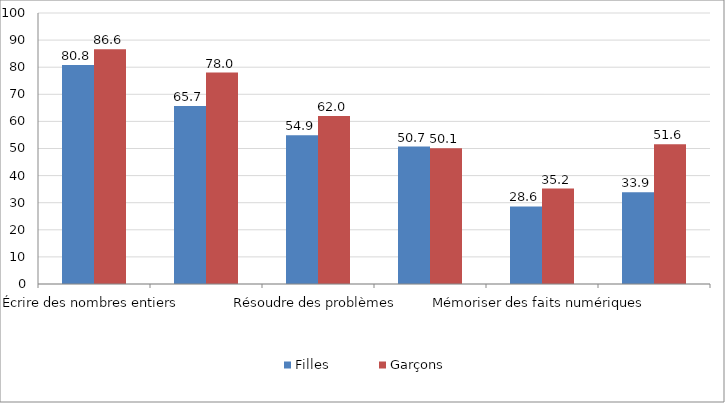
| Category | Filles | Garçons |
|---|---|---|
| Écrire des nombres entiers | 80.8 | 86.6 |
| Placer un nombre sur une ligne graduée | 65.7 | 78 |
| Résoudre des problèmes | 54.9 | 62 |
| Poser et calculer | 50.7 | 50.1 |
| Mémoriser des faits numériques | 28.6 | 35.2 |
| Mémoriser des procédures | 33.9 | 51.6 |